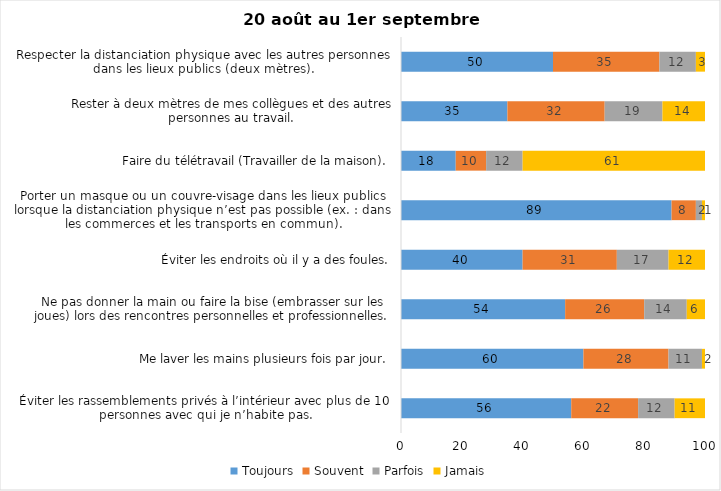
| Category | Toujours | Souvent | Parfois | Jamais |
|---|---|---|---|---|
| Éviter les rassemblements privés à l’intérieur avec plus de 10 personnes avec qui je n’habite pas. | 56 | 22 | 12 | 11 |
| Me laver les mains plusieurs fois par jour. | 60 | 28 | 11 | 2 |
| Ne pas donner la main ou faire la bise (embrasser sur les joues) lors des rencontres personnelles et professionnelles. | 54 | 26 | 14 | 6 |
| Éviter les endroits où il y a des foules. | 40 | 31 | 17 | 12 |
| Porter un masque ou un couvre-visage dans les lieux publics lorsque la distanciation physique n’est pas possible (ex. : dans les commerces et les transports en commun). | 89 | 8 | 2 | 1 |
| Faire du télétravail (Travailler de la maison). | 18 | 10 | 12 | 61 |
| Rester à deux mètres de mes collègues et des autres personnes au travail. | 35 | 32 | 19 | 14 |
| Respecter la distanciation physique avec les autres personnes dans les lieux publics (deux mètres). | 50 | 35 | 12 | 3 |